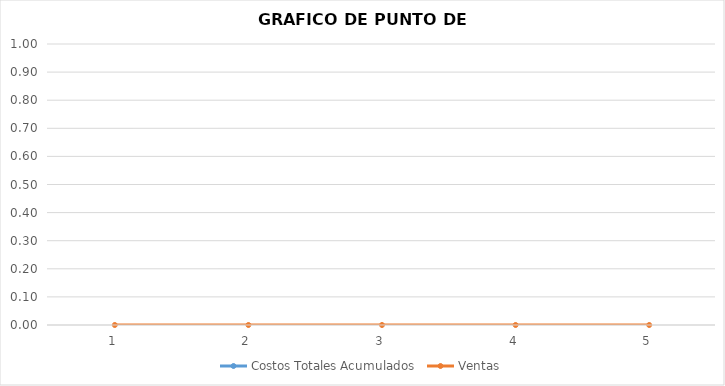
| Category | Costos Totales Acumulados | Ventas |
|---|---|---|
| 1.0 |  | 0 |
| 2.0 |  | 0 |
| 3.0 |  | 0 |
| 4.0 |  | 0 |
| 5.0 |  | 0 |